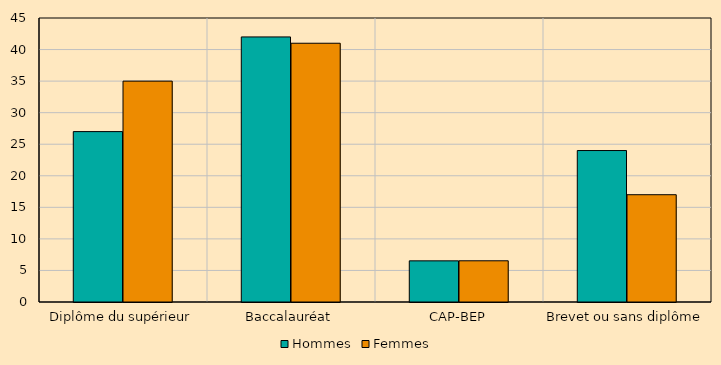
| Category | Hommes | Femmes  |
|---|---|---|
| Diplôme du supérieur | 27 | 35 |
| Baccalauréat | 42 | 41 |
| CAP-BEP | 6.52 | 6.53 |
| Brevet ou sans diplôme | 24 | 17 |